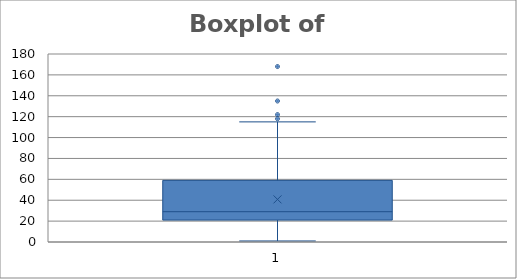
| Category | Wind |
|---|---|
| 67.0 | 7.4 |
| 72.0 | 8 |
| 74.0 | 12.6 |
| 62.0 | 11.5 |
| 56.0 | 14.3 |
| 66.0 | 14.9 |
| 65.0 | 8.6 |
| 59.0 | 13.8 |
| 61.0 | 20.1 |
| 69.0 | 8.6 |
| 74.0 | 6.9 |
| 69.0 | 9.7 |
| 66.0 | 9.2 |
| 68.0 | 10.9 |
| 58.0 | 13.2 |
| 64.0 | 11.5 |
| 66.0 | 12 |
| 57.0 | 18.4 |
| 68.0 | 11.5 |
| 62.0 | 9.7 |
| 59.0 | 9.7 |
| 73.0 | 16.6 |
| 61.0 | 9.7 |
| 61.0 | 12 |
| 57.0 | 16.6 |
| 58.0 | 14.9 |
| 57.0 | 8 |
| 67.0 | 12 |
| 81.0 | 14.9 |
| 79.0 | 5.7 |
| 76.0 | 7.4 |
| 78.0 | 8.6 |
| 74.0 | 9.7 |
| 67.0 | 16.1 |
| 84.0 | 9.2 |
| 85.0 | 8.6 |
| 79.0 | 14.3 |
| 82.0 | 9.7 |
| 87.0 | 6.9 |
| 90.0 | 13.8 |
| 87.0 | 11.5 |
| 93.0 | 10.9 |
| 92.0 | 9.2 |
| 82.0 | 8 |
| 80.0 | 13.8 |
| 79.0 | 11.5 |
| 77.0 | 14.9 |
| 72.0 | 20.7 |
| 65.0 | 9.2 |
| 73.0 | 11.5 |
| 76.0 | 10.3 |
| 77.0 | 6.3 |
| 76.0 | 1.7 |
| 76.0 | 4.6 |
| 76.0 | 6.3 |
| 75.0 | 8 |
| 78.0 | 8 |
| 73.0 | 10.3 |
| 80.0 | 11.5 |
| 77.0 | 14.9 |
| 83.0 | 8 |
| 84.0 | 4.1 |
| 85.0 | 9.2 |
| 81.0 | 9.2 |
| 84.0 | 10.9 |
| 83.0 | 4.6 |
| 83.0 | 10.9 |
| 88.0 | 5.1 |
| 92.0 | 6.3 |
| 92.0 | 5.7 |
| 89.0 | 7.4 |
| 82.0 | 8.6 |
| 73.0 | 14.3 |
| 81.0 | 14.9 |
| 91.0 | 14.9 |
| 80.0 | 14.3 |
| 81.0 | 6.9 |
| 82.0 | 10.3 |
| 84.0 | 6.3 |
| 87.0 | 5.1 |
| 85.0 | 11.5 |
| 74.0 | 6.9 |
| 81.0 | 9.7 |
| 82.0 | 11.5 |
| 86.0 | 8.6 |
| 85.0 | 8 |
| 82.0 | 8.6 |
| 86.0 | 12 |
| 88.0 | 7.4 |
| 86.0 | 7.4 |
| 83.0 | 7.4 |
| 81.0 | 9.2 |
| 81.0 | 6.9 |
| 81.0 | 13.8 |
| 82.0 | 7.4 |
| 86.0 | 6.9 |
| 85.0 | 7.4 |
| 87.0 | 4.6 |
| 89.0 | 4 |
| 90.0 | 10.3 |
| 90.0 | 8 |
| 92.0 | 8.6 |
| 86.0 | 11.5 |
| 86.0 | 11.5 |
| 82.0 | 11.5 |
| 80.0 | 9.7 |
| 79.0 | 11.5 |
| 77.0 | 10.3 |
| 79.0 | 6.3 |
| 76.0 | 7.4 |
| 78.0 | 10.9 |
| 78.0 | 10.3 |
| 77.0 | 15.5 |
| 72.0 | 14.3 |
| 75.0 | 12.6 |
| 79.0 | 9.7 |
| 81.0 | 3.4 |
| 86.0 | 8 |
| 88.0 | 5.7 |
| 97.0 | 9.7 |
| 94.0 | 2.3 |
| 96.0 | 6.3 |
| 94.0 | 6.3 |
| 91.0 | 6.9 |
| 92.0 | 5.1 |
| 93.0 | 2.8 |
| 93.0 | 4.6 |
| 87.0 | 7.4 |
| 84.0 | 15.5 |
| 80.0 | 10.9 |
| 78.0 | 10.3 |
| 75.0 | 10.9 |
| 73.0 | 9.7 |
| 81.0 | 14.9 |
| 76.0 | 15.5 |
| 77.0 | 6.3 |
| 71.0 | 10.9 |
| 71.0 | 11.5 |
| 78.0 | 6.9 |
| 67.0 | 13.8 |
| 76.0 | 10.3 |
| 68.0 | 10.3 |
| 82.0 | 8 |
| 64.0 | 12.6 |
| 71.0 | 9.2 |
| 81.0 | 10.3 |
| 69.0 | 10.3 |
| 63.0 | 16.6 |
| 70.0 | 6.9 |
| 77.0 | 13.2 |
| 75.0 | 14.3 |
| 76.0 | 8 |
| 68.0 | 11.5 |